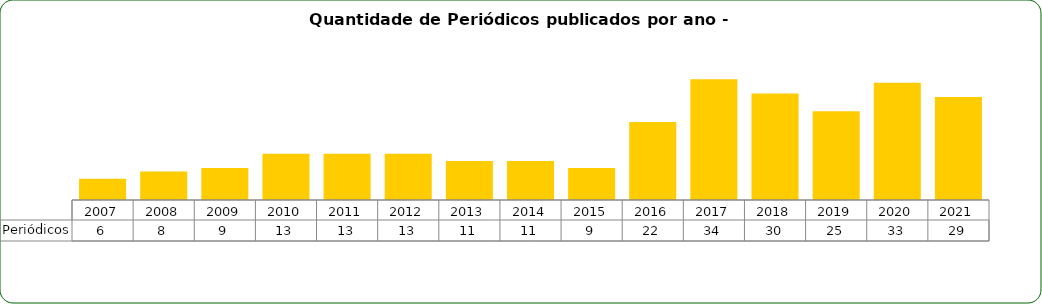
| Category | Periódicos |
|---|---|
| 2007.0 | 6 |
| 2008.0 | 8 |
| 2009.0 | 9 |
| 2010.0 | 13 |
| 2011.0 | 13 |
| 2012.0 | 13 |
| 2013.0 | 11 |
| 2014.0 | 11 |
| 2015.0 | 9 |
| 2016.0 | 22 |
| 2017.0 | 34 |
| 2018.0 | 30 |
| 2019.0 | 25 |
| 2020.0 | 33 |
| 2021.0 | 29 |